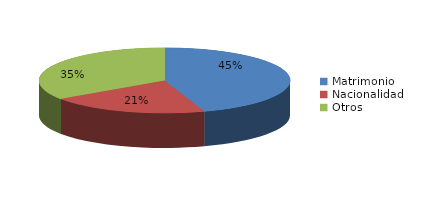
| Category | Series 0 |
|---|---|
| Matrimonio | 3160 |
| Nacionalidad | 1446 |
| Otros | 2435 |